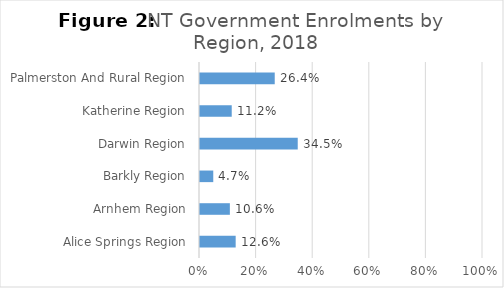
| Category | Series 0 |
|---|---|
| Alice Springs Region | 0.126 |
| Arnhem Region | 0.106 |
| Barkly Region | 0.047 |
| Darwin Region | 0.345 |
| Katherine Region | 0.112 |
| Palmerston And Rural Region | 0.264 |